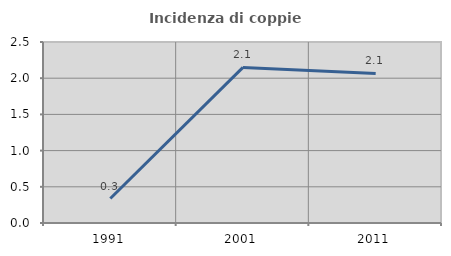
| Category | Incidenza di coppie miste |
|---|---|
| 1991.0 | 0.338 |
| 2001.0 | 2.149 |
| 2011.0 | 2.066 |